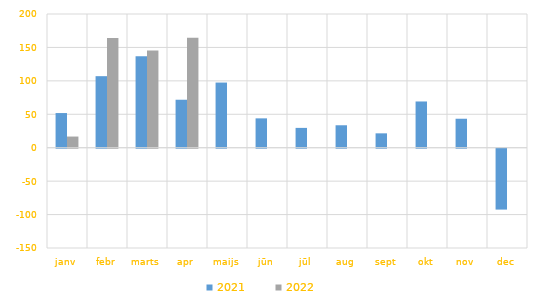
| Category | 2021 | 2022 |
|---|---|---|
| janv | 51841.777 | 16703.923 |
| febr | 107011.894 | 164205.671 |
| marts | 136866.315 | 145513.563 |
| apr | 71755.584 | 164636.583 |
| maijs | 97451.146 | 0 |
| jūn | 43904.827 | 0 |
| jūl | 29653.452 | 0 |
| aug | 33579 | 0 |
| sept | 21501.571 | 0 |
| okt | 69163.685 | 0 |
| nov | 43347 | 0 |
| dec | -91047.788 | 0 |